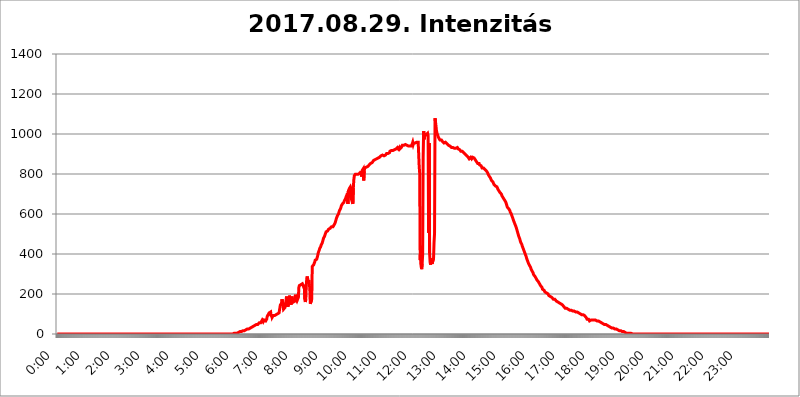
| Category | 2017.08.29. Intenzitás [W/m^2] |
|---|---|
| 0.0 | 0 |
| 0.0006944444444444445 | 0 |
| 0.001388888888888889 | 0 |
| 0.0020833333333333333 | 0 |
| 0.002777777777777778 | 0 |
| 0.003472222222222222 | 0 |
| 0.004166666666666667 | 0 |
| 0.004861111111111111 | 0 |
| 0.005555555555555556 | 0 |
| 0.0062499999999999995 | 0 |
| 0.006944444444444444 | 0 |
| 0.007638888888888889 | 0 |
| 0.008333333333333333 | 0 |
| 0.009027777777777779 | 0 |
| 0.009722222222222222 | 0 |
| 0.010416666666666666 | 0 |
| 0.011111111111111112 | 0 |
| 0.011805555555555555 | 0 |
| 0.012499999999999999 | 0 |
| 0.013194444444444444 | 0 |
| 0.013888888888888888 | 0 |
| 0.014583333333333332 | 0 |
| 0.015277777777777777 | 0 |
| 0.015972222222222224 | 0 |
| 0.016666666666666666 | 0 |
| 0.017361111111111112 | 0 |
| 0.018055555555555557 | 0 |
| 0.01875 | 0 |
| 0.019444444444444445 | 0 |
| 0.02013888888888889 | 0 |
| 0.020833333333333332 | 0 |
| 0.02152777777777778 | 0 |
| 0.022222222222222223 | 0 |
| 0.02291666666666667 | 0 |
| 0.02361111111111111 | 0 |
| 0.024305555555555556 | 0 |
| 0.024999999999999998 | 0 |
| 0.025694444444444447 | 0 |
| 0.02638888888888889 | 0 |
| 0.027083333333333334 | 0 |
| 0.027777777777777776 | 0 |
| 0.02847222222222222 | 0 |
| 0.029166666666666664 | 0 |
| 0.029861111111111113 | 0 |
| 0.030555555555555555 | 0 |
| 0.03125 | 0 |
| 0.03194444444444445 | 0 |
| 0.03263888888888889 | 0 |
| 0.03333333333333333 | 0 |
| 0.034027777777777775 | 0 |
| 0.034722222222222224 | 0 |
| 0.035416666666666666 | 0 |
| 0.036111111111111115 | 0 |
| 0.03680555555555556 | 0 |
| 0.0375 | 0 |
| 0.03819444444444444 | 0 |
| 0.03888888888888889 | 0 |
| 0.03958333333333333 | 0 |
| 0.04027777777777778 | 0 |
| 0.04097222222222222 | 0 |
| 0.041666666666666664 | 0 |
| 0.042361111111111106 | 0 |
| 0.04305555555555556 | 0 |
| 0.043750000000000004 | 0 |
| 0.044444444444444446 | 0 |
| 0.04513888888888889 | 0 |
| 0.04583333333333334 | 0 |
| 0.04652777777777778 | 0 |
| 0.04722222222222222 | 0 |
| 0.04791666666666666 | 0 |
| 0.04861111111111111 | 0 |
| 0.049305555555555554 | 0 |
| 0.049999999999999996 | 0 |
| 0.05069444444444445 | 0 |
| 0.051388888888888894 | 0 |
| 0.052083333333333336 | 0 |
| 0.05277777777777778 | 0 |
| 0.05347222222222222 | 0 |
| 0.05416666666666667 | 0 |
| 0.05486111111111111 | 0 |
| 0.05555555555555555 | 0 |
| 0.05625 | 0 |
| 0.05694444444444444 | 0 |
| 0.057638888888888885 | 0 |
| 0.05833333333333333 | 0 |
| 0.05902777777777778 | 0 |
| 0.059722222222222225 | 0 |
| 0.06041666666666667 | 0 |
| 0.061111111111111116 | 0 |
| 0.06180555555555556 | 0 |
| 0.0625 | 0 |
| 0.06319444444444444 | 0 |
| 0.06388888888888888 | 0 |
| 0.06458333333333334 | 0 |
| 0.06527777777777778 | 0 |
| 0.06597222222222222 | 0 |
| 0.06666666666666667 | 0 |
| 0.06736111111111111 | 0 |
| 0.06805555555555555 | 0 |
| 0.06874999999999999 | 0 |
| 0.06944444444444443 | 0 |
| 0.07013888888888889 | 0 |
| 0.07083333333333333 | 0 |
| 0.07152777777777779 | 0 |
| 0.07222222222222223 | 0 |
| 0.07291666666666667 | 0 |
| 0.07361111111111111 | 0 |
| 0.07430555555555556 | 0 |
| 0.075 | 0 |
| 0.07569444444444444 | 0 |
| 0.0763888888888889 | 0 |
| 0.07708333333333334 | 0 |
| 0.07777777777777778 | 0 |
| 0.07847222222222222 | 0 |
| 0.07916666666666666 | 0 |
| 0.0798611111111111 | 0 |
| 0.08055555555555556 | 0 |
| 0.08125 | 0 |
| 0.08194444444444444 | 0 |
| 0.08263888888888889 | 0 |
| 0.08333333333333333 | 0 |
| 0.08402777777777777 | 0 |
| 0.08472222222222221 | 0 |
| 0.08541666666666665 | 0 |
| 0.08611111111111112 | 0 |
| 0.08680555555555557 | 0 |
| 0.08750000000000001 | 0 |
| 0.08819444444444445 | 0 |
| 0.08888888888888889 | 0 |
| 0.08958333333333333 | 0 |
| 0.09027777777777778 | 0 |
| 0.09097222222222222 | 0 |
| 0.09166666666666667 | 0 |
| 0.09236111111111112 | 0 |
| 0.09305555555555556 | 0 |
| 0.09375 | 0 |
| 0.09444444444444444 | 0 |
| 0.09513888888888888 | 0 |
| 0.09583333333333333 | 0 |
| 0.09652777777777777 | 0 |
| 0.09722222222222222 | 0 |
| 0.09791666666666667 | 0 |
| 0.09861111111111111 | 0 |
| 0.09930555555555555 | 0 |
| 0.09999999999999999 | 0 |
| 0.10069444444444443 | 0 |
| 0.1013888888888889 | 0 |
| 0.10208333333333335 | 0 |
| 0.10277777777777779 | 0 |
| 0.10347222222222223 | 0 |
| 0.10416666666666667 | 0 |
| 0.10486111111111111 | 0 |
| 0.10555555555555556 | 0 |
| 0.10625 | 0 |
| 0.10694444444444444 | 0 |
| 0.1076388888888889 | 0 |
| 0.10833333333333334 | 0 |
| 0.10902777777777778 | 0 |
| 0.10972222222222222 | 0 |
| 0.1111111111111111 | 0 |
| 0.11180555555555556 | 0 |
| 0.11180555555555556 | 0 |
| 0.1125 | 0 |
| 0.11319444444444444 | 0 |
| 0.11388888888888889 | 0 |
| 0.11458333333333333 | 0 |
| 0.11527777777777777 | 0 |
| 0.11597222222222221 | 0 |
| 0.11666666666666665 | 0 |
| 0.1173611111111111 | 0 |
| 0.11805555555555557 | 0 |
| 0.11944444444444445 | 0 |
| 0.12013888888888889 | 0 |
| 0.12083333333333333 | 0 |
| 0.12152777777777778 | 0 |
| 0.12222222222222223 | 0 |
| 0.12291666666666667 | 0 |
| 0.12291666666666667 | 0 |
| 0.12361111111111112 | 0 |
| 0.12430555555555556 | 0 |
| 0.125 | 0 |
| 0.12569444444444444 | 0 |
| 0.12638888888888888 | 0 |
| 0.12708333333333333 | 0 |
| 0.16875 | 0 |
| 0.12847222222222224 | 0 |
| 0.12916666666666668 | 0 |
| 0.12986111111111112 | 0 |
| 0.13055555555555556 | 0 |
| 0.13125 | 0 |
| 0.13194444444444445 | 0 |
| 0.1326388888888889 | 0 |
| 0.13333333333333333 | 0 |
| 0.13402777777777777 | 0 |
| 0.13402777777777777 | 0 |
| 0.13472222222222222 | 0 |
| 0.13541666666666666 | 0 |
| 0.1361111111111111 | 0 |
| 0.13749999999999998 | 0 |
| 0.13819444444444443 | 0 |
| 0.1388888888888889 | 0 |
| 0.13958333333333334 | 0 |
| 0.14027777777777778 | 0 |
| 0.14097222222222222 | 0 |
| 0.14166666666666666 | 0 |
| 0.1423611111111111 | 0 |
| 0.14305555555555557 | 0 |
| 0.14375000000000002 | 0 |
| 0.14444444444444446 | 0 |
| 0.1451388888888889 | 0 |
| 0.1451388888888889 | 0 |
| 0.14652777777777778 | 0 |
| 0.14722222222222223 | 0 |
| 0.14791666666666667 | 0 |
| 0.1486111111111111 | 0 |
| 0.14930555555555555 | 0 |
| 0.15 | 0 |
| 0.15069444444444444 | 0 |
| 0.15138888888888888 | 0 |
| 0.15208333333333332 | 0 |
| 0.15277777777777776 | 0 |
| 0.15347222222222223 | 0 |
| 0.15416666666666667 | 0 |
| 0.15486111111111112 | 0 |
| 0.15555555555555556 | 0 |
| 0.15625 | 0 |
| 0.15694444444444444 | 0 |
| 0.15763888888888888 | 0 |
| 0.15833333333333333 | 0 |
| 0.15902777777777777 | 0 |
| 0.15972222222222224 | 0 |
| 0.16041666666666668 | 0 |
| 0.16111111111111112 | 0 |
| 0.16180555555555556 | 0 |
| 0.1625 | 0 |
| 0.16319444444444445 | 0 |
| 0.1638888888888889 | 0 |
| 0.16458333333333333 | 0 |
| 0.16527777777777777 | 0 |
| 0.16597222222222222 | 0 |
| 0.16666666666666666 | 0 |
| 0.1673611111111111 | 0 |
| 0.16805555555555554 | 0 |
| 0.16874999999999998 | 0 |
| 0.16944444444444443 | 0 |
| 0.17013888888888887 | 0 |
| 0.1708333333333333 | 0 |
| 0.17152777777777775 | 0 |
| 0.17222222222222225 | 0 |
| 0.1729166666666667 | 0 |
| 0.17361111111111113 | 0 |
| 0.17430555555555557 | 0 |
| 0.17500000000000002 | 0 |
| 0.17569444444444446 | 0 |
| 0.1763888888888889 | 0 |
| 0.17708333333333334 | 0 |
| 0.17777777777777778 | 0 |
| 0.17847222222222223 | 0 |
| 0.17916666666666667 | 0 |
| 0.1798611111111111 | 0 |
| 0.18055555555555555 | 0 |
| 0.18125 | 0 |
| 0.18194444444444444 | 0 |
| 0.1826388888888889 | 0 |
| 0.18333333333333335 | 0 |
| 0.1840277777777778 | 0 |
| 0.18472222222222223 | 0 |
| 0.18541666666666667 | 0 |
| 0.18611111111111112 | 0 |
| 0.18680555555555556 | 0 |
| 0.1875 | 0 |
| 0.18819444444444444 | 0 |
| 0.18888888888888888 | 0 |
| 0.18958333333333333 | 0 |
| 0.19027777777777777 | 0 |
| 0.1909722222222222 | 0 |
| 0.19166666666666665 | 0 |
| 0.19236111111111112 | 0 |
| 0.19305555555555554 | 0 |
| 0.19375 | 0 |
| 0.19444444444444445 | 0 |
| 0.1951388888888889 | 0 |
| 0.19583333333333333 | 0 |
| 0.19652777777777777 | 0 |
| 0.19722222222222222 | 0 |
| 0.19791666666666666 | 0 |
| 0.1986111111111111 | 0 |
| 0.19930555555555554 | 0 |
| 0.19999999999999998 | 0 |
| 0.20069444444444443 | 0 |
| 0.20138888888888887 | 0 |
| 0.2020833333333333 | 0 |
| 0.2027777777777778 | 0 |
| 0.2034722222222222 | 0 |
| 0.2041666666666667 | 0 |
| 0.20486111111111113 | 0 |
| 0.20555555555555557 | 0 |
| 0.20625000000000002 | 0 |
| 0.20694444444444446 | 0 |
| 0.2076388888888889 | 0 |
| 0.20833333333333334 | 0 |
| 0.20902777777777778 | 0 |
| 0.20972222222222223 | 0 |
| 0.21041666666666667 | 0 |
| 0.2111111111111111 | 0 |
| 0.21180555555555555 | 0 |
| 0.2125 | 0 |
| 0.21319444444444444 | 0 |
| 0.2138888888888889 | 0 |
| 0.21458333333333335 | 0 |
| 0.2152777777777778 | 0 |
| 0.21597222222222223 | 0 |
| 0.21666666666666667 | 0 |
| 0.21736111111111112 | 0 |
| 0.21805555555555556 | 0 |
| 0.21875 | 0 |
| 0.21944444444444444 | 0 |
| 0.22013888888888888 | 0 |
| 0.22083333333333333 | 0 |
| 0.22152777777777777 | 0 |
| 0.2222222222222222 | 0 |
| 0.22291666666666665 | 0 |
| 0.2236111111111111 | 0 |
| 0.22430555555555556 | 0 |
| 0.225 | 0 |
| 0.22569444444444445 | 0 |
| 0.2263888888888889 | 0 |
| 0.22708333333333333 | 0 |
| 0.22777777777777777 | 0 |
| 0.22847222222222222 | 0 |
| 0.22916666666666666 | 0 |
| 0.2298611111111111 | 0 |
| 0.23055555555555554 | 0 |
| 0.23124999999999998 | 0 |
| 0.23194444444444443 | 0 |
| 0.23263888888888887 | 0 |
| 0.2333333333333333 | 0 |
| 0.2340277777777778 | 0 |
| 0.2347222222222222 | 0 |
| 0.2354166666666667 | 0 |
| 0.23611111111111113 | 0 |
| 0.23680555555555557 | 0 |
| 0.23750000000000002 | 0 |
| 0.23819444444444446 | 0 |
| 0.2388888888888889 | 0 |
| 0.23958333333333334 | 0 |
| 0.24027777777777778 | 0 |
| 0.24097222222222223 | 0 |
| 0.24166666666666667 | 0 |
| 0.2423611111111111 | 0 |
| 0.24305555555555555 | 0 |
| 0.24375 | 0 |
| 0.24444444444444446 | 0 |
| 0.24513888888888888 | 0 |
| 0.24583333333333335 | 0 |
| 0.2465277777777778 | 3.525 |
| 0.24722222222222223 | 3.525 |
| 0.24791666666666667 | 3.525 |
| 0.24861111111111112 | 3.525 |
| 0.24930555555555556 | 3.525 |
| 0.25 | 3.525 |
| 0.25069444444444444 | 3.525 |
| 0.2513888888888889 | 3.525 |
| 0.2520833333333333 | 3.525 |
| 0.25277777777777777 | 7.887 |
| 0.2534722222222222 | 7.887 |
| 0.25416666666666665 | 7.887 |
| 0.2548611111111111 | 7.887 |
| 0.2555555555555556 | 7.887 |
| 0.25625000000000003 | 12.257 |
| 0.2569444444444445 | 12.257 |
| 0.2576388888888889 | 12.257 |
| 0.25833333333333336 | 12.257 |
| 0.2590277777777778 | 12.257 |
| 0.25972222222222224 | 12.257 |
| 0.2604166666666667 | 16.636 |
| 0.2611111111111111 | 16.636 |
| 0.26180555555555557 | 16.636 |
| 0.2625 | 16.636 |
| 0.26319444444444445 | 21.024 |
| 0.2638888888888889 | 21.024 |
| 0.26458333333333334 | 21.024 |
| 0.2652777777777778 | 21.024 |
| 0.2659722222222222 | 21.024 |
| 0.26666666666666666 | 25.419 |
| 0.2673611111111111 | 25.419 |
| 0.26805555555555555 | 25.419 |
| 0.26875 | 25.419 |
| 0.26944444444444443 | 29.823 |
| 0.2701388888888889 | 29.823 |
| 0.2708333333333333 | 29.823 |
| 0.27152777777777776 | 29.823 |
| 0.2722222222222222 | 34.234 |
| 0.27291666666666664 | 34.234 |
| 0.2736111111111111 | 34.234 |
| 0.2743055555555555 | 34.234 |
| 0.27499999999999997 | 38.653 |
| 0.27569444444444446 | 38.653 |
| 0.27638888888888885 | 43.079 |
| 0.27708333333333335 | 43.079 |
| 0.2777777777777778 | 47.511 |
| 0.27847222222222223 | 47.511 |
| 0.2791666666666667 | 47.511 |
| 0.2798611111111111 | 47.511 |
| 0.28055555555555556 | 47.511 |
| 0.28125 | 47.511 |
| 0.28194444444444444 | 51.951 |
| 0.2826388888888889 | 51.951 |
| 0.2833333333333333 | 56.398 |
| 0.28402777777777777 | 56.398 |
| 0.2847222222222222 | 56.398 |
| 0.28541666666666665 | 56.398 |
| 0.28611111111111115 | 56.398 |
| 0.28680555555555554 | 60.85 |
| 0.28750000000000003 | 69.775 |
| 0.2881944444444445 | 65.31 |
| 0.2888888888888889 | 60.85 |
| 0.28958333333333336 | 60.85 |
| 0.2902777777777778 | 69.775 |
| 0.29097222222222224 | 65.31 |
| 0.2916666666666667 | 65.31 |
| 0.2923611111111111 | 65.31 |
| 0.29305555555555557 | 65.31 |
| 0.29375 | 74.246 |
| 0.29444444444444445 | 87.692 |
| 0.2951388888888889 | 83.205 |
| 0.29583333333333334 | 96.682 |
| 0.2965277777777778 | 101.184 |
| 0.2972222222222222 | 105.69 |
| 0.29791666666666666 | 110.201 |
| 0.2986111111111111 | 110.201 |
| 0.29930555555555555 | 110.201 |
| 0.3 | 87.692 |
| 0.30069444444444443 | 96.682 |
| 0.3013888888888889 | 83.205 |
| 0.3020833333333333 | 87.692 |
| 0.30277777777777776 | 92.184 |
| 0.3034722222222222 | 92.184 |
| 0.30416666666666664 | 92.184 |
| 0.3048611111111111 | 92.184 |
| 0.3055555555555555 | 96.682 |
| 0.30624999999999997 | 96.682 |
| 0.3069444444444444 | 96.682 |
| 0.3076388888888889 | 101.184 |
| 0.30833333333333335 | 101.184 |
| 0.3090277777777778 | 101.184 |
| 0.30972222222222223 | 101.184 |
| 0.3104166666666667 | 105.69 |
| 0.3111111111111111 | 105.69 |
| 0.31180555555555556 | 101.184 |
| 0.3125 | 105.69 |
| 0.31319444444444444 | 150.964 |
| 0.3138888888888889 | 141.884 |
| 0.3145833333333333 | 155.509 |
| 0.31527777777777777 | 173.709 |
| 0.3159722222222222 | 160.056 |
| 0.31666666666666665 | 141.884 |
| 0.31736111111111115 | 123.758 |
| 0.31805555555555554 | 123.758 |
| 0.31875000000000003 | 123.758 |
| 0.3194444444444445 | 132.814 |
| 0.3201388888888889 | 150.964 |
| 0.32083333333333336 | 164.605 |
| 0.3215277777777778 | 187.378 |
| 0.32222222222222224 | 137.347 |
| 0.3229166666666667 | 155.509 |
| 0.3236111111111111 | 137.347 |
| 0.32430555555555557 | 155.509 |
| 0.325 | 169.156 |
| 0.32569444444444445 | 191.937 |
| 0.3263888888888889 | 169.156 |
| 0.32708333333333334 | 160.056 |
| 0.3277777777777778 | 146.423 |
| 0.3284722222222222 | 150.964 |
| 0.32916666666666666 | 187.378 |
| 0.3298611111111111 | 169.156 |
| 0.33055555555555555 | 178.264 |
| 0.33125 | 160.056 |
| 0.33194444444444443 | 164.605 |
| 0.3326388888888889 | 160.056 |
| 0.3333333333333333 | 164.605 |
| 0.3340277777777778 | 196.497 |
| 0.3347222222222222 | 173.709 |
| 0.3354166666666667 | 169.156 |
| 0.3361111111111111 | 164.605 |
| 0.3368055555555556 | 164.605 |
| 0.33749999999999997 | 164.605 |
| 0.33819444444444446 | 182.82 |
| 0.33888888888888885 | 233 |
| 0.33958333333333335 | 242.127 |
| 0.34027777777777773 | 242.127 |
| 0.34097222222222223 | 242.127 |
| 0.3416666666666666 | 246.689 |
| 0.3423611111111111 | 251.251 |
| 0.3430555555555555 | 251.251 |
| 0.34375 | 251.251 |
| 0.3444444444444445 | 255.813 |
| 0.3451388888888889 | 251.251 |
| 0.3458333333333334 | 233 |
| 0.34652777777777777 | 246.689 |
| 0.34722222222222227 | 173.709 |
| 0.34791666666666665 | 160.056 |
| 0.34861111111111115 | 173.709 |
| 0.34930555555555554 | 246.689 |
| 0.35000000000000003 | 278.603 |
| 0.3506944444444444 | 287.709 |
| 0.3513888888888889 | 292.259 |
| 0.3520833333333333 | 255.813 |
| 0.3527777777777778 | 269.49 |
| 0.3534722222222222 | 242.127 |
| 0.3541666666666667 | 233 |
| 0.3548611111111111 | 150.964 |
| 0.35555555555555557 | 146.423 |
| 0.35625 | 155.509 |
| 0.35694444444444445 | 173.709 |
| 0.3576388888888889 | 337.639 |
| 0.35833333333333334 | 342.162 |
| 0.3590277777777778 | 342.162 |
| 0.3597222222222222 | 346.682 |
| 0.36041666666666666 | 351.198 |
| 0.3611111111111111 | 360.221 |
| 0.36180555555555555 | 369.23 |
| 0.3625 | 369.23 |
| 0.36319444444444443 | 373.729 |
| 0.3638888888888889 | 373.729 |
| 0.3645833333333333 | 373.729 |
| 0.3652777777777778 | 391.685 |
| 0.3659722222222222 | 405.108 |
| 0.3666666666666667 | 409.574 |
| 0.3673611111111111 | 418.492 |
| 0.3680555555555556 | 427.39 |
| 0.36874999999999997 | 431.833 |
| 0.36944444444444446 | 436.27 |
| 0.37013888888888885 | 445.129 |
| 0.37083333333333335 | 449.551 |
| 0.37152777777777773 | 453.968 |
| 0.37222222222222223 | 458.38 |
| 0.3729166666666666 | 471.582 |
| 0.3736111111111111 | 480.356 |
| 0.3743055555555555 | 484.735 |
| 0.375 | 489.108 |
| 0.3756944444444445 | 497.836 |
| 0.3763888888888889 | 502.192 |
| 0.3770833333333334 | 510.885 |
| 0.37777777777777777 | 515.223 |
| 0.37847222222222227 | 515.223 |
| 0.37916666666666665 | 515.223 |
| 0.37986111111111115 | 519.555 |
| 0.38055555555555554 | 523.88 |
| 0.38125000000000003 | 523.88 |
| 0.3819444444444444 | 528.2 |
| 0.3826388888888889 | 528.2 |
| 0.3833333333333333 | 528.2 |
| 0.3840277777777778 | 532.513 |
| 0.3847222222222222 | 536.82 |
| 0.3854166666666667 | 536.82 |
| 0.3861111111111111 | 536.82 |
| 0.38680555555555557 | 536.82 |
| 0.3875 | 541.121 |
| 0.38819444444444445 | 545.416 |
| 0.3888888888888889 | 549.704 |
| 0.38958333333333334 | 553.986 |
| 0.3902777777777778 | 562.53 |
| 0.3909722222222222 | 571.049 |
| 0.39166666666666666 | 579.542 |
| 0.3923611111111111 | 583.779 |
| 0.39305555555555555 | 592.233 |
| 0.39375 | 596.45 |
| 0.39444444444444443 | 600.661 |
| 0.3951388888888889 | 609.062 |
| 0.3958333333333333 | 617.436 |
| 0.3965277777777778 | 621.613 |
| 0.3972222222222222 | 625.784 |
| 0.3979166666666667 | 629.948 |
| 0.3986111111111111 | 642.4 |
| 0.3993055555555556 | 646.537 |
| 0.39999999999999997 | 650.667 |
| 0.40069444444444446 | 654.791 |
| 0.40138888888888885 | 654.791 |
| 0.40208333333333335 | 658.909 |
| 0.40277777777777773 | 667.123 |
| 0.40347222222222223 | 671.22 |
| 0.4041666666666666 | 675.311 |
| 0.4048611111111111 | 683.473 |
| 0.4055555555555555 | 687.544 |
| 0.40625 | 695.666 |
| 0.4069444444444445 | 703.762 |
| 0.4076388888888889 | 650.667 |
| 0.4083333333333334 | 715.858 |
| 0.40902777777777777 | 719.877 |
| 0.40972222222222227 | 727.896 |
| 0.41041666666666665 | 731.896 |
| 0.41111111111111115 | 735.89 |
| 0.41180555555555554 | 727.896 |
| 0.41250000000000003 | 675.311 |
| 0.4131944444444444 | 675.311 |
| 0.4138888888888889 | 679.395 |
| 0.4145833333333333 | 650.667 |
| 0.4152777777777778 | 731.896 |
| 0.4159722222222222 | 771.559 |
| 0.4166666666666667 | 791.169 |
| 0.4173611111111111 | 795.074 |
| 0.41805555555555557 | 798.974 |
| 0.41875 | 798.974 |
| 0.41944444444444445 | 795.074 |
| 0.4201388888888889 | 798.974 |
| 0.42083333333333334 | 798.974 |
| 0.4215277777777778 | 802.868 |
| 0.4222222222222222 | 798.974 |
| 0.42291666666666666 | 802.868 |
| 0.4236111111111111 | 802.868 |
| 0.42430555555555555 | 802.868 |
| 0.425 | 810.641 |
| 0.42569444444444443 | 798.974 |
| 0.4263888888888889 | 814.519 |
| 0.4270833333333333 | 787.258 |
| 0.4277777777777778 | 818.392 |
| 0.4284722222222222 | 818.392 |
| 0.4291666666666667 | 826.123 |
| 0.4298611111111111 | 767.62 |
| 0.4305555555555556 | 814.519 |
| 0.43124999999999997 | 829.981 |
| 0.43194444444444446 | 829.981 |
| 0.43263888888888885 | 829.981 |
| 0.43333333333333335 | 833.834 |
| 0.43402777777777773 | 837.682 |
| 0.43472222222222223 | 837.682 |
| 0.4354166666666666 | 837.682 |
| 0.4361111111111111 | 841.526 |
| 0.4368055555555555 | 841.526 |
| 0.4375 | 845.365 |
| 0.4381944444444445 | 845.365 |
| 0.4388888888888889 | 849.199 |
| 0.4395833333333334 | 853.029 |
| 0.44027777777777777 | 853.029 |
| 0.44097222222222227 | 856.855 |
| 0.44166666666666665 | 856.855 |
| 0.44236111111111115 | 860.676 |
| 0.44305555555555554 | 860.676 |
| 0.44375000000000003 | 868.305 |
| 0.4444444444444444 | 868.305 |
| 0.4451388888888889 | 868.305 |
| 0.4458333333333333 | 872.114 |
| 0.4465277777777778 | 875.918 |
| 0.4472222222222222 | 875.918 |
| 0.4479166666666667 | 875.918 |
| 0.4486111111111111 | 872.114 |
| 0.44930555555555557 | 879.719 |
| 0.45 | 879.719 |
| 0.45069444444444445 | 883.516 |
| 0.4513888888888889 | 883.516 |
| 0.45208333333333334 | 883.516 |
| 0.4527777777777778 | 887.309 |
| 0.4534722222222222 | 887.309 |
| 0.45416666666666666 | 891.099 |
| 0.4548611111111111 | 894.885 |
| 0.45555555555555555 | 891.099 |
| 0.45625 | 894.885 |
| 0.45694444444444443 | 894.885 |
| 0.4576388888888889 | 894.885 |
| 0.4583333333333333 | 891.099 |
| 0.4590277777777778 | 894.885 |
| 0.4597222222222222 | 894.885 |
| 0.4604166666666667 | 894.885 |
| 0.4611111111111111 | 898.668 |
| 0.4618055555555556 | 902.447 |
| 0.46249999999999997 | 902.447 |
| 0.46319444444444446 | 902.447 |
| 0.46388888888888885 | 902.447 |
| 0.46458333333333335 | 902.447 |
| 0.46527777777777773 | 902.447 |
| 0.46597222222222223 | 906.223 |
| 0.4666666666666666 | 913.766 |
| 0.4673611111111111 | 913.766 |
| 0.4680555555555555 | 917.534 |
| 0.46875 | 917.534 |
| 0.4694444444444445 | 917.534 |
| 0.4701388888888889 | 917.534 |
| 0.4708333333333334 | 917.534 |
| 0.47152777777777777 | 917.534 |
| 0.47222222222222227 | 921.298 |
| 0.47291666666666665 | 921.298 |
| 0.47361111111111115 | 921.298 |
| 0.47430555555555554 | 925.06 |
| 0.47500000000000003 | 925.06 |
| 0.4756944444444444 | 925.06 |
| 0.4763888888888889 | 928.819 |
| 0.4770833333333333 | 932.576 |
| 0.4777777777777778 | 928.819 |
| 0.4784722222222222 | 925.06 |
| 0.4791666666666667 | 928.819 |
| 0.4798611111111111 | 932.576 |
| 0.48055555555555557 | 925.06 |
| 0.48125 | 921.298 |
| 0.48194444444444445 | 925.06 |
| 0.4826388888888889 | 932.576 |
| 0.48333333333333334 | 936.33 |
| 0.4840277777777778 | 943.832 |
| 0.4847222222222222 | 943.832 |
| 0.48541666666666666 | 947.58 |
| 0.4861111111111111 | 943.832 |
| 0.48680555555555555 | 943.832 |
| 0.4875 | 940.082 |
| 0.48819444444444443 | 947.58 |
| 0.4888888888888889 | 943.832 |
| 0.4895833333333333 | 943.832 |
| 0.4902777777777778 | 943.832 |
| 0.4909722222222222 | 940.082 |
| 0.4916666666666667 | 940.082 |
| 0.4923611111111111 | 940.082 |
| 0.4930555555555556 | 940.082 |
| 0.49374999999999997 | 940.082 |
| 0.49444444444444446 | 940.082 |
| 0.49513888888888885 | 943.832 |
| 0.49583333333333335 | 940.082 |
| 0.49652777777777773 | 940.082 |
| 0.49722222222222223 | 940.082 |
| 0.4979166666666666 | 951.327 |
| 0.4986111111111111 | 958.814 |
| 0.4993055555555555 | 947.58 |
| 0.5 | 955.071 |
| 0.5006944444444444 | 951.327 |
| 0.5013888888888889 | 951.327 |
| 0.5020833333333333 | 955.071 |
| 0.5027777777777778 | 951.327 |
| 0.5034722222222222 | 955.071 |
| 0.5041666666666667 | 958.814 |
| 0.5048611111111111 | 962.555 |
| 0.5055555555555555 | 958.814 |
| 0.50625 | 958.814 |
| 0.5069444444444444 | 962.555 |
| 0.5076388888888889 | 837.682 |
| 0.5083333333333333 | 802.868 |
| 0.5090277777777777 | 369.23 |
| 0.5097222222222222 | 440.702 |
| 0.5104166666666666 | 337.639 |
| 0.5111111111111112 | 324.052 |
| 0.5118055555555555 | 351.198 |
| 0.5125000000000001 | 396.164 |
| 0.5131944444444444 | 883.516 |
| 0.513888888888889 | 1014.852 |
| 0.5145833333333333 | 973.772 |
| 0.5152777777777778 | 999.916 |
| 0.5159722222222222 | 996.182 |
| 0.5166666666666667 | 996.182 |
| 0.517361111111111 | 996.182 |
| 0.5180555555555556 | 999.916 |
| 0.5187499999999999 | 999.916 |
| 0.5194444444444445 | 1003.65 |
| 0.5201388888888888 | 992.448 |
| 0.5208333333333334 | 506.542 |
| 0.5215277777777778 | 955.071 |
| 0.5222222222222223 | 405.108 |
| 0.5229166666666667 | 360.221 |
| 0.5236111111111111 | 346.682 |
| 0.5243055555555556 | 360.221 |
| 0.525 | 378.224 |
| 0.5256944444444445 | 351.198 |
| 0.5263888888888889 | 351.198 |
| 0.5270833333333333 | 351.198 |
| 0.5277777777777778 | 378.224 |
| 0.5284722222222222 | 458.38 |
| 0.5291666666666667 | 502.192 |
| 0.5298611111111111 | 1078.555 |
| 0.5305555555555556 | 1059.756 |
| 0.53125 | 1037.277 |
| 0.5319444444444444 | 1014.852 |
| 0.5326388888888889 | 1003.65 |
| 0.5333333333333333 | 999.916 |
| 0.5340277777777778 | 988.714 |
| 0.5347222222222222 | 984.98 |
| 0.5354166666666667 | 977.508 |
| 0.5361111111111111 | 973.772 |
| 0.5368055555555555 | 970.034 |
| 0.5375 | 970.034 |
| 0.5381944444444444 | 970.034 |
| 0.5388888888888889 | 970.034 |
| 0.5395833333333333 | 966.295 |
| 0.5402777777777777 | 962.555 |
| 0.5409722222222222 | 958.814 |
| 0.5416666666666666 | 958.814 |
| 0.5423611111111112 | 955.071 |
| 0.5430555555555555 | 958.814 |
| 0.5437500000000001 | 958.814 |
| 0.5444444444444444 | 958.814 |
| 0.545138888888889 | 958.814 |
| 0.5458333333333333 | 955.071 |
| 0.5465277777777778 | 951.327 |
| 0.5472222222222222 | 951.327 |
| 0.5479166666666667 | 947.58 |
| 0.548611111111111 | 943.832 |
| 0.5493055555555556 | 940.082 |
| 0.5499999999999999 | 940.082 |
| 0.5506944444444445 | 940.082 |
| 0.5513888888888888 | 936.33 |
| 0.5520833333333334 | 936.33 |
| 0.5527777777777778 | 932.576 |
| 0.5534722222222223 | 932.576 |
| 0.5541666666666667 | 932.576 |
| 0.5548611111111111 | 932.576 |
| 0.5555555555555556 | 932.576 |
| 0.55625 | 932.576 |
| 0.5569444444444445 | 928.819 |
| 0.5576388888888889 | 928.819 |
| 0.5583333333333333 | 928.819 |
| 0.5590277777777778 | 928.819 |
| 0.5597222222222222 | 932.576 |
| 0.5604166666666667 | 932.576 |
| 0.5611111111111111 | 932.576 |
| 0.5618055555555556 | 928.819 |
| 0.5625 | 925.06 |
| 0.5631944444444444 | 925.06 |
| 0.5638888888888889 | 925.06 |
| 0.5645833333333333 | 921.298 |
| 0.5652777777777778 | 917.534 |
| 0.5659722222222222 | 913.766 |
| 0.5666666666666667 | 913.766 |
| 0.5673611111111111 | 913.766 |
| 0.5680555555555555 | 913.766 |
| 0.56875 | 909.996 |
| 0.5694444444444444 | 909.996 |
| 0.5701388888888889 | 906.223 |
| 0.5708333333333333 | 906.223 |
| 0.5715277777777777 | 902.447 |
| 0.5722222222222222 | 898.668 |
| 0.5729166666666666 | 894.885 |
| 0.5736111111111112 | 894.885 |
| 0.5743055555555555 | 891.099 |
| 0.5750000000000001 | 887.309 |
| 0.5756944444444444 | 891.099 |
| 0.576388888888889 | 883.516 |
| 0.5770833333333333 | 887.309 |
| 0.5777777777777778 | 875.918 |
| 0.5784722222222222 | 879.719 |
| 0.5791666666666667 | 879.719 |
| 0.579861111111111 | 883.516 |
| 0.5805555555555556 | 879.719 |
| 0.5812499999999999 | 875.918 |
| 0.5819444444444445 | 879.719 |
| 0.5826388888888888 | 883.516 |
| 0.5833333333333334 | 883.516 |
| 0.5840277777777778 | 879.719 |
| 0.5847222222222223 | 879.719 |
| 0.5854166666666667 | 879.719 |
| 0.5861111111111111 | 875.918 |
| 0.5868055555555556 | 868.305 |
| 0.5875 | 864.493 |
| 0.5881944444444445 | 860.676 |
| 0.5888888888888889 | 860.676 |
| 0.5895833333333333 | 853.029 |
| 0.5902777777777778 | 853.029 |
| 0.5909722222222222 | 856.855 |
| 0.5916666666666667 | 853.029 |
| 0.5923611111111111 | 845.365 |
| 0.5930555555555556 | 849.199 |
| 0.59375 | 845.365 |
| 0.5944444444444444 | 841.526 |
| 0.5951388888888889 | 837.682 |
| 0.5958333333333333 | 829.981 |
| 0.5965277777777778 | 833.834 |
| 0.5972222222222222 | 833.834 |
| 0.5979166666666667 | 829.981 |
| 0.5986111111111111 | 829.981 |
| 0.5993055555555555 | 826.123 |
| 0.6 | 822.26 |
| 0.6006944444444444 | 822.26 |
| 0.6013888888888889 | 818.392 |
| 0.6020833333333333 | 814.519 |
| 0.6027777777777777 | 810.641 |
| 0.6034722222222222 | 806.757 |
| 0.6041666666666666 | 802.868 |
| 0.6048611111111112 | 795.074 |
| 0.6055555555555555 | 791.169 |
| 0.6062500000000001 | 787.258 |
| 0.6069444444444444 | 783.342 |
| 0.607638888888889 | 779.42 |
| 0.6083333333333333 | 775.492 |
| 0.6090277777777778 | 767.62 |
| 0.6097222222222222 | 767.62 |
| 0.6104166666666667 | 763.674 |
| 0.611111111111111 | 759.723 |
| 0.6118055555555556 | 755.766 |
| 0.6124999999999999 | 747.834 |
| 0.6131944444444445 | 743.859 |
| 0.6138888888888888 | 743.859 |
| 0.6145833333333334 | 739.877 |
| 0.6152777777777778 | 739.877 |
| 0.6159722222222223 | 739.877 |
| 0.6166666666666667 | 735.89 |
| 0.6173611111111111 | 731.896 |
| 0.6180555555555556 | 723.889 |
| 0.61875 | 719.877 |
| 0.6194444444444445 | 715.858 |
| 0.6201388888888889 | 711.832 |
| 0.6208333333333333 | 707.8 |
| 0.6215277777777778 | 703.762 |
| 0.6222222222222222 | 703.762 |
| 0.6229166666666667 | 699.717 |
| 0.6236111111111111 | 691.608 |
| 0.6243055555555556 | 687.544 |
| 0.625 | 687.544 |
| 0.6256944444444444 | 679.395 |
| 0.6263888888888889 | 675.311 |
| 0.6270833333333333 | 675.311 |
| 0.6277777777777778 | 667.123 |
| 0.6284722222222222 | 663.019 |
| 0.6291666666666667 | 658.909 |
| 0.6298611111111111 | 654.791 |
| 0.6305555555555555 | 642.4 |
| 0.63125 | 634.105 |
| 0.6319444444444444 | 634.105 |
| 0.6326388888888889 | 629.948 |
| 0.6333333333333333 | 625.784 |
| 0.6340277777777777 | 621.613 |
| 0.6347222222222222 | 617.436 |
| 0.6354166666666666 | 609.062 |
| 0.6361111111111112 | 604.864 |
| 0.6368055555555555 | 600.661 |
| 0.6375000000000001 | 592.233 |
| 0.6381944444444444 | 588.009 |
| 0.638888888888889 | 579.542 |
| 0.6395833333333333 | 571.049 |
| 0.6402777777777778 | 566.793 |
| 0.6409722222222222 | 558.261 |
| 0.6416666666666667 | 553.986 |
| 0.642361111111111 | 545.416 |
| 0.6430555555555556 | 541.121 |
| 0.6437499999999999 | 532.513 |
| 0.6444444444444445 | 523.88 |
| 0.6451388888888888 | 515.223 |
| 0.6458333333333334 | 506.542 |
| 0.6465277777777778 | 497.836 |
| 0.6472222222222223 | 489.108 |
| 0.6479166666666667 | 484.735 |
| 0.6486111111111111 | 475.972 |
| 0.6493055555555556 | 467.187 |
| 0.65 | 458.38 |
| 0.6506944444444445 | 453.968 |
| 0.6513888888888889 | 449.551 |
| 0.6520833333333333 | 440.702 |
| 0.6527777777777778 | 436.27 |
| 0.6534722222222222 | 427.39 |
| 0.6541666666666667 | 422.943 |
| 0.6548611111111111 | 414.035 |
| 0.6555555555555556 | 409.574 |
| 0.65625 | 400.638 |
| 0.6569444444444444 | 396.164 |
| 0.6576388888888889 | 387.202 |
| 0.6583333333333333 | 378.224 |
| 0.6590277777777778 | 373.729 |
| 0.6597222222222222 | 364.728 |
| 0.6604166666666667 | 360.221 |
| 0.6611111111111111 | 351.198 |
| 0.6618055555555555 | 346.682 |
| 0.6625 | 342.162 |
| 0.6631944444444444 | 337.639 |
| 0.6638888888888889 | 333.113 |
| 0.6645833333333333 | 324.052 |
| 0.6652777777777777 | 319.517 |
| 0.6659722222222222 | 314.98 |
| 0.6666666666666666 | 310.44 |
| 0.6673611111111111 | 305.898 |
| 0.6680555555555556 | 296.808 |
| 0.6687500000000001 | 296.808 |
| 0.6694444444444444 | 292.259 |
| 0.6701388888888888 | 287.709 |
| 0.6708333333333334 | 283.156 |
| 0.6715277777777778 | 278.603 |
| 0.6722222222222222 | 274.047 |
| 0.6729166666666666 | 269.49 |
| 0.6736111111111112 | 264.932 |
| 0.6743055555555556 | 264.932 |
| 0.6749999999999999 | 260.373 |
| 0.6756944444444444 | 255.813 |
| 0.6763888888888889 | 251.251 |
| 0.6770833333333334 | 246.689 |
| 0.6777777777777777 | 242.127 |
| 0.6784722222222223 | 237.564 |
| 0.6791666666666667 | 237.564 |
| 0.6798611111111111 | 233 |
| 0.6805555555555555 | 223.873 |
| 0.68125 | 223.873 |
| 0.6819444444444445 | 219.309 |
| 0.6826388888888889 | 219.309 |
| 0.6833333333333332 | 214.746 |
| 0.6840277777777778 | 210.182 |
| 0.6847222222222222 | 210.182 |
| 0.6854166666666667 | 205.62 |
| 0.686111111111111 | 205.62 |
| 0.6868055555555556 | 205.62 |
| 0.6875 | 201.058 |
| 0.6881944444444444 | 201.058 |
| 0.688888888888889 | 196.497 |
| 0.6895833333333333 | 191.937 |
| 0.6902777777777778 | 191.937 |
| 0.6909722222222222 | 191.937 |
| 0.6916666666666668 | 187.378 |
| 0.6923611111111111 | 187.378 |
| 0.6930555555555555 | 182.82 |
| 0.69375 | 182.82 |
| 0.6944444444444445 | 182.82 |
| 0.6951388888888889 | 178.264 |
| 0.6958333333333333 | 173.709 |
| 0.6965277777777777 | 173.709 |
| 0.6972222222222223 | 173.709 |
| 0.6979166666666666 | 173.709 |
| 0.6986111111111111 | 169.156 |
| 0.6993055555555556 | 169.156 |
| 0.7000000000000001 | 164.605 |
| 0.7006944444444444 | 164.605 |
| 0.7013888888888888 | 164.605 |
| 0.7020833333333334 | 160.056 |
| 0.7027777777777778 | 160.056 |
| 0.7034722222222222 | 160.056 |
| 0.7041666666666666 | 155.509 |
| 0.7048611111111112 | 155.509 |
| 0.7055555555555556 | 155.509 |
| 0.7062499999999999 | 150.964 |
| 0.7069444444444444 | 150.964 |
| 0.7076388888888889 | 150.964 |
| 0.7083333333333334 | 146.423 |
| 0.7090277777777777 | 146.423 |
| 0.7097222222222223 | 141.884 |
| 0.7104166666666667 | 137.347 |
| 0.7111111111111111 | 132.814 |
| 0.7118055555555555 | 132.814 |
| 0.7125 | 128.284 |
| 0.7131944444444445 | 128.284 |
| 0.7138888888888889 | 128.284 |
| 0.7145833333333332 | 128.284 |
| 0.7152777777777778 | 128.284 |
| 0.7159722222222222 | 123.758 |
| 0.7166666666666667 | 123.758 |
| 0.717361111111111 | 123.758 |
| 0.7180555555555556 | 123.758 |
| 0.71875 | 119.235 |
| 0.7194444444444444 | 119.235 |
| 0.720138888888889 | 119.235 |
| 0.7208333333333333 | 119.235 |
| 0.7215277777777778 | 119.235 |
| 0.7222222222222222 | 114.716 |
| 0.7229166666666668 | 114.716 |
| 0.7236111111111111 | 114.716 |
| 0.7243055555555555 | 114.716 |
| 0.725 | 114.716 |
| 0.7256944444444445 | 110.201 |
| 0.7263888888888889 | 110.201 |
| 0.7270833333333333 | 110.201 |
| 0.7277777777777777 | 110.201 |
| 0.7284722222222223 | 110.201 |
| 0.7291666666666666 | 110.201 |
| 0.7298611111111111 | 105.69 |
| 0.7305555555555556 | 105.69 |
| 0.7312500000000001 | 105.69 |
| 0.7319444444444444 | 105.69 |
| 0.7326388888888888 | 101.184 |
| 0.7333333333333334 | 101.184 |
| 0.7340277777777778 | 101.184 |
| 0.7347222222222222 | 101.184 |
| 0.7354166666666666 | 96.682 |
| 0.7361111111111112 | 96.682 |
| 0.7368055555555556 | 96.682 |
| 0.7374999999999999 | 96.682 |
| 0.7381944444444444 | 92.184 |
| 0.7388888888888889 | 92.184 |
| 0.7395833333333334 | 92.184 |
| 0.7402777777777777 | 87.692 |
| 0.7409722222222223 | 87.692 |
| 0.7416666666666667 | 83.205 |
| 0.7423611111111111 | 78.722 |
| 0.7430555555555555 | 74.246 |
| 0.74375 | 78.722 |
| 0.7444444444444445 | 78.722 |
| 0.7451388888888889 | 74.246 |
| 0.7458333333333332 | 74.246 |
| 0.7465277777777778 | 65.31 |
| 0.7472222222222222 | 65.31 |
| 0.7479166666666667 | 65.31 |
| 0.748611111111111 | 69.775 |
| 0.7493055555555556 | 74.246 |
| 0.75 | 74.246 |
| 0.7506944444444444 | 69.775 |
| 0.751388888888889 | 65.31 |
| 0.7520833333333333 | 65.31 |
| 0.7527777777777778 | 69.775 |
| 0.7534722222222222 | 69.775 |
| 0.7541666666666668 | 69.775 |
| 0.7548611111111111 | 69.775 |
| 0.7555555555555555 | 69.775 |
| 0.75625 | 65.31 |
| 0.7569444444444445 | 65.31 |
| 0.7576388888888889 | 65.31 |
| 0.7583333333333333 | 65.31 |
| 0.7590277777777777 | 65.31 |
| 0.7597222222222223 | 60.85 |
| 0.7604166666666666 | 60.85 |
| 0.7611111111111111 | 60.85 |
| 0.7618055555555556 | 56.398 |
| 0.7625000000000001 | 56.398 |
| 0.7631944444444444 | 56.398 |
| 0.7638888888888888 | 56.398 |
| 0.7645833333333334 | 51.951 |
| 0.7652777777777778 | 51.951 |
| 0.7659722222222222 | 51.951 |
| 0.7666666666666666 | 47.511 |
| 0.7673611111111112 | 47.511 |
| 0.7680555555555556 | 47.511 |
| 0.7687499999999999 | 47.511 |
| 0.7694444444444444 | 47.511 |
| 0.7701388888888889 | 43.079 |
| 0.7708333333333334 | 43.079 |
| 0.7715277777777777 | 43.079 |
| 0.7722222222222223 | 38.653 |
| 0.7729166666666667 | 38.653 |
| 0.7736111111111111 | 38.653 |
| 0.7743055555555555 | 38.653 |
| 0.775 | 34.234 |
| 0.7756944444444445 | 34.234 |
| 0.7763888888888889 | 34.234 |
| 0.7770833333333332 | 29.823 |
| 0.7777777777777778 | 29.823 |
| 0.7784722222222222 | 29.823 |
| 0.7791666666666667 | 29.823 |
| 0.779861111111111 | 29.823 |
| 0.7805555555555556 | 29.823 |
| 0.78125 | 25.419 |
| 0.7819444444444444 | 25.419 |
| 0.782638888888889 | 25.419 |
| 0.7833333333333333 | 25.419 |
| 0.7840277777777778 | 25.419 |
| 0.7847222222222222 | 21.024 |
| 0.7854166666666668 | 21.024 |
| 0.7861111111111111 | 21.024 |
| 0.7868055555555555 | 21.024 |
| 0.7875 | 21.024 |
| 0.7881944444444445 | 16.636 |
| 0.7888888888888889 | 16.636 |
| 0.7895833333333333 | 16.636 |
| 0.7902777777777777 | 16.636 |
| 0.7909722222222223 | 16.636 |
| 0.7916666666666666 | 12.257 |
| 0.7923611111111111 | 12.257 |
| 0.7930555555555556 | 12.257 |
| 0.7937500000000001 | 12.257 |
| 0.7944444444444444 | 12.257 |
| 0.7951388888888888 | 12.257 |
| 0.7958333333333334 | 7.887 |
| 0.7965277777777778 | 7.887 |
| 0.7972222222222222 | 7.887 |
| 0.7979166666666666 | 7.887 |
| 0.7986111111111112 | 3.525 |
| 0.7993055555555556 | 3.525 |
| 0.7999999999999999 | 3.525 |
| 0.8006944444444444 | 3.525 |
| 0.8013888888888889 | 3.525 |
| 0.8020833333333334 | 3.525 |
| 0.8027777777777777 | 3.525 |
| 0.8034722222222223 | 3.525 |
| 0.8041666666666667 | 3.525 |
| 0.8048611111111111 | 3.525 |
| 0.8055555555555555 | 0 |
| 0.80625 | 0 |
| 0.8069444444444445 | 0 |
| 0.8076388888888889 | 0 |
| 0.8083333333333332 | 0 |
| 0.8090277777777778 | 0 |
| 0.8097222222222222 | 0 |
| 0.8104166666666667 | 0 |
| 0.811111111111111 | 0 |
| 0.8118055555555556 | 0 |
| 0.8125 | 0 |
| 0.8131944444444444 | 0 |
| 0.813888888888889 | 0 |
| 0.8145833333333333 | 0 |
| 0.8152777777777778 | 0 |
| 0.8159722222222222 | 0 |
| 0.8166666666666668 | 0 |
| 0.8173611111111111 | 0 |
| 0.8180555555555555 | 0 |
| 0.81875 | 0 |
| 0.8194444444444445 | 0 |
| 0.8201388888888889 | 0 |
| 0.8208333333333333 | 0 |
| 0.8215277777777777 | 0 |
| 0.8222222222222223 | 0 |
| 0.8229166666666666 | 0 |
| 0.8236111111111111 | 0 |
| 0.8243055555555556 | 0 |
| 0.8250000000000001 | 0 |
| 0.8256944444444444 | 0 |
| 0.8263888888888888 | 0 |
| 0.8270833333333334 | 0 |
| 0.8277777777777778 | 0 |
| 0.8284722222222222 | 0 |
| 0.8291666666666666 | 0 |
| 0.8298611111111112 | 0 |
| 0.8305555555555556 | 0 |
| 0.8312499999999999 | 0 |
| 0.8319444444444444 | 0 |
| 0.8326388888888889 | 0 |
| 0.8333333333333334 | 0 |
| 0.8340277777777777 | 0 |
| 0.8347222222222223 | 0 |
| 0.8354166666666667 | 0 |
| 0.8361111111111111 | 0 |
| 0.8368055555555555 | 0 |
| 0.8375 | 0 |
| 0.8381944444444445 | 0 |
| 0.8388888888888889 | 0 |
| 0.8395833333333332 | 0 |
| 0.8402777777777778 | 0 |
| 0.8409722222222222 | 0 |
| 0.8416666666666667 | 0 |
| 0.842361111111111 | 0 |
| 0.8430555555555556 | 0 |
| 0.84375 | 0 |
| 0.8444444444444444 | 0 |
| 0.845138888888889 | 0 |
| 0.8458333333333333 | 0 |
| 0.8465277777777778 | 0 |
| 0.8472222222222222 | 0 |
| 0.8479166666666668 | 0 |
| 0.8486111111111111 | 0 |
| 0.8493055555555555 | 0 |
| 0.85 | 0 |
| 0.8506944444444445 | 0 |
| 0.8513888888888889 | 0 |
| 0.8520833333333333 | 0 |
| 0.8527777777777777 | 0 |
| 0.8534722222222223 | 0 |
| 0.8541666666666666 | 0 |
| 0.8548611111111111 | 0 |
| 0.8555555555555556 | 0 |
| 0.8562500000000001 | 0 |
| 0.8569444444444444 | 0 |
| 0.8576388888888888 | 0 |
| 0.8583333333333334 | 0 |
| 0.8590277777777778 | 0 |
| 0.8597222222222222 | 0 |
| 0.8604166666666666 | 0 |
| 0.8611111111111112 | 0 |
| 0.8618055555555556 | 0 |
| 0.8624999999999999 | 0 |
| 0.8631944444444444 | 0 |
| 0.8638888888888889 | 0 |
| 0.8645833333333334 | 0 |
| 0.8652777777777777 | 0 |
| 0.8659722222222223 | 0 |
| 0.8666666666666667 | 0 |
| 0.8673611111111111 | 0 |
| 0.8680555555555555 | 0 |
| 0.86875 | 0 |
| 0.8694444444444445 | 0 |
| 0.8701388888888889 | 0 |
| 0.8708333333333332 | 0 |
| 0.8715277777777778 | 0 |
| 0.8722222222222222 | 0 |
| 0.8729166666666667 | 0 |
| 0.873611111111111 | 0 |
| 0.8743055555555556 | 0 |
| 0.875 | 0 |
| 0.8756944444444444 | 0 |
| 0.876388888888889 | 0 |
| 0.8770833333333333 | 0 |
| 0.8777777777777778 | 0 |
| 0.8784722222222222 | 0 |
| 0.8791666666666668 | 0 |
| 0.8798611111111111 | 0 |
| 0.8805555555555555 | 0 |
| 0.88125 | 0 |
| 0.8819444444444445 | 0 |
| 0.8826388888888889 | 0 |
| 0.8833333333333333 | 0 |
| 0.8840277777777777 | 0 |
| 0.8847222222222223 | 0 |
| 0.8854166666666666 | 0 |
| 0.8861111111111111 | 0 |
| 0.8868055555555556 | 0 |
| 0.8875000000000001 | 0 |
| 0.8881944444444444 | 0 |
| 0.8888888888888888 | 0 |
| 0.8895833333333334 | 0 |
| 0.8902777777777778 | 0 |
| 0.8909722222222222 | 0 |
| 0.8916666666666666 | 0 |
| 0.8923611111111112 | 0 |
| 0.8930555555555556 | 0 |
| 0.8937499999999999 | 0 |
| 0.8944444444444444 | 0 |
| 0.8951388888888889 | 0 |
| 0.8958333333333334 | 0 |
| 0.8965277777777777 | 0 |
| 0.8972222222222223 | 0 |
| 0.8979166666666667 | 0 |
| 0.8986111111111111 | 0 |
| 0.8993055555555555 | 0 |
| 0.9 | 0 |
| 0.9006944444444445 | 0 |
| 0.9013888888888889 | 0 |
| 0.9020833333333332 | 0 |
| 0.9027777777777778 | 0 |
| 0.9034722222222222 | 0 |
| 0.9041666666666667 | 0 |
| 0.904861111111111 | 0 |
| 0.9055555555555556 | 0 |
| 0.90625 | 0 |
| 0.9069444444444444 | 0 |
| 0.907638888888889 | 0 |
| 0.9083333333333333 | 0 |
| 0.9090277777777778 | 0 |
| 0.9097222222222222 | 0 |
| 0.9104166666666668 | 0 |
| 0.9111111111111111 | 0 |
| 0.9118055555555555 | 0 |
| 0.9125 | 0 |
| 0.9131944444444445 | 0 |
| 0.9138888888888889 | 0 |
| 0.9145833333333333 | 0 |
| 0.9152777777777777 | 0 |
| 0.9159722222222223 | 0 |
| 0.9166666666666666 | 0 |
| 0.9173611111111111 | 0 |
| 0.9180555555555556 | 0 |
| 0.9187500000000001 | 0 |
| 0.9194444444444444 | 0 |
| 0.9201388888888888 | 0 |
| 0.9208333333333334 | 0 |
| 0.9215277777777778 | 0 |
| 0.9222222222222222 | 0 |
| 0.9229166666666666 | 0 |
| 0.9236111111111112 | 0 |
| 0.9243055555555556 | 0 |
| 0.9249999999999999 | 0 |
| 0.9256944444444444 | 0 |
| 0.9263888888888889 | 0 |
| 0.9270833333333334 | 0 |
| 0.9277777777777777 | 0 |
| 0.9284722222222223 | 0 |
| 0.9291666666666667 | 0 |
| 0.9298611111111111 | 0 |
| 0.9305555555555555 | 0 |
| 0.93125 | 0 |
| 0.9319444444444445 | 0 |
| 0.9326388888888889 | 0 |
| 0.9333333333333332 | 0 |
| 0.9340277777777778 | 0 |
| 0.9347222222222222 | 0 |
| 0.9354166666666667 | 0 |
| 0.936111111111111 | 0 |
| 0.9368055555555556 | 0 |
| 0.9375 | 0 |
| 0.9381944444444444 | 0 |
| 0.938888888888889 | 0 |
| 0.9395833333333333 | 0 |
| 0.9402777777777778 | 0 |
| 0.9409722222222222 | 0 |
| 0.9416666666666668 | 0 |
| 0.9423611111111111 | 0 |
| 0.9430555555555555 | 0 |
| 0.94375 | 0 |
| 0.9444444444444445 | 0 |
| 0.9451388888888889 | 0 |
| 0.9458333333333333 | 0 |
| 0.9465277777777777 | 0 |
| 0.9472222222222223 | 0 |
| 0.9479166666666666 | 0 |
| 0.9486111111111111 | 0 |
| 0.9493055555555556 | 0 |
| 0.9500000000000001 | 0 |
| 0.9506944444444444 | 0 |
| 0.9513888888888888 | 0 |
| 0.9520833333333334 | 0 |
| 0.9527777777777778 | 0 |
| 0.9534722222222222 | 0 |
| 0.9541666666666666 | 0 |
| 0.9548611111111112 | 0 |
| 0.9555555555555556 | 0 |
| 0.9562499999999999 | 0 |
| 0.9569444444444444 | 0 |
| 0.9576388888888889 | 0 |
| 0.9583333333333334 | 0 |
| 0.9590277777777777 | 0 |
| 0.9597222222222223 | 0 |
| 0.9604166666666667 | 0 |
| 0.9611111111111111 | 0 |
| 0.9618055555555555 | 0 |
| 0.9625 | 0 |
| 0.9631944444444445 | 0 |
| 0.9638888888888889 | 0 |
| 0.9645833333333332 | 0 |
| 0.9652777777777778 | 0 |
| 0.9659722222222222 | 0 |
| 0.9666666666666667 | 0 |
| 0.967361111111111 | 0 |
| 0.9680555555555556 | 0 |
| 0.96875 | 0 |
| 0.9694444444444444 | 0 |
| 0.970138888888889 | 0 |
| 0.9708333333333333 | 0 |
| 0.9715277777777778 | 0 |
| 0.9722222222222222 | 0 |
| 0.9729166666666668 | 0 |
| 0.9736111111111111 | 0 |
| 0.9743055555555555 | 0 |
| 0.975 | 0 |
| 0.9756944444444445 | 0 |
| 0.9763888888888889 | 0 |
| 0.9770833333333333 | 0 |
| 0.9777777777777777 | 0 |
| 0.9784722222222223 | 0 |
| 0.9791666666666666 | 0 |
| 0.9798611111111111 | 0 |
| 0.9805555555555556 | 0 |
| 0.9812500000000001 | 0 |
| 0.9819444444444444 | 0 |
| 0.9826388888888888 | 0 |
| 0.9833333333333334 | 0 |
| 0.9840277777777778 | 0 |
| 0.9847222222222222 | 0 |
| 0.9854166666666666 | 0 |
| 0.9861111111111112 | 0 |
| 0.9868055555555556 | 0 |
| 0.9874999999999999 | 0 |
| 0.9881944444444444 | 0 |
| 0.9888888888888889 | 0 |
| 0.9895833333333334 | 0 |
| 0.9902777777777777 | 0 |
| 0.9909722222222223 | 0 |
| 0.9916666666666667 | 0 |
| 0.9923611111111111 | 0 |
| 0.9930555555555555 | 0 |
| 0.99375 | 0 |
| 0.9944444444444445 | 0 |
| 0.9951388888888889 | 0 |
| 0.9958333333333332 | 0 |
| 0.9965277777777778 | 0 |
| 0.9972222222222222 | 0 |
| 0.9979166666666667 | 0 |
| 0.998611111111111 | 0 |
| 0.9993055555555556 | 0 |